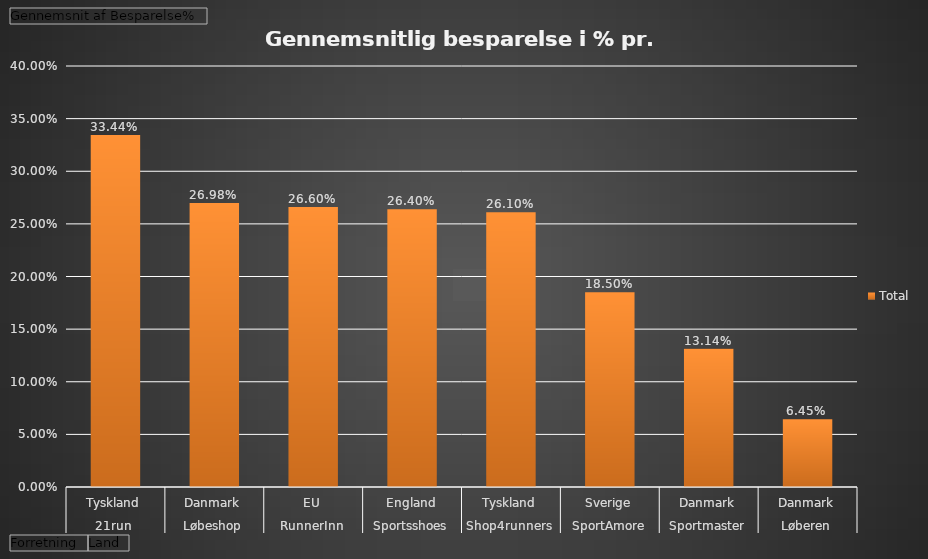
| Category | Total |
|---|---|
| 0 | 0.334 |
| 1 | 0.27 |
| 2 | 0.266 |
| 3 | 0.264 |
| 4 | 0.261 |
| 5 | 0.185 |
| 6 | 0.131 |
| 7 | 0.064 |